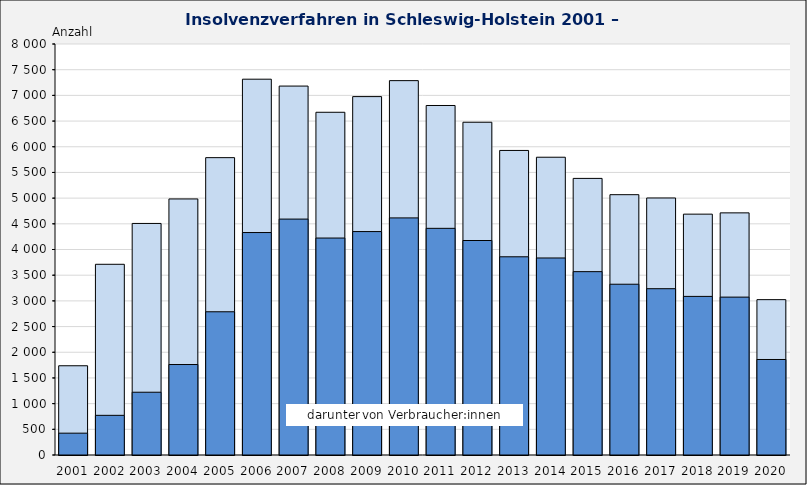
| Category | Insgesamt | Darunter Verbraucher:innen |
|---|---|---|
| 2001.0 | 1737 | 425 |
| 2002.0 | 3712 | 772 |
| 2003.0 | 4507 | 1222 |
| 2004.0 | 4984 | 1761 |
| 2005.0 | 5788 | 2788 |
| 2006.0 | 7315 | 4330 |
| 2007.0 | 7181 | 4592 |
| 2008.0 | 6671 | 4223 |
| 2009.0 | 6976 | 4349 |
| 2010.0 | 7287 | 4615 |
| 2011.0 | 6803 | 4412 |
| 2012.0 | 6477 | 4175 |
| 2013.0 | 5928 | 3858 |
| 2014.0 | 5796 | 3835 |
| 2015.0 | 5384 | 3569 |
| 2016.0 | 5067 | 3324 |
| 2017.0 | 5003 | 3237 |
| 2018.0 | 4688 | 3087 |
| 2019.0 | 4713 | 3073 |
| 2020.0 | 3024 | 1859 |